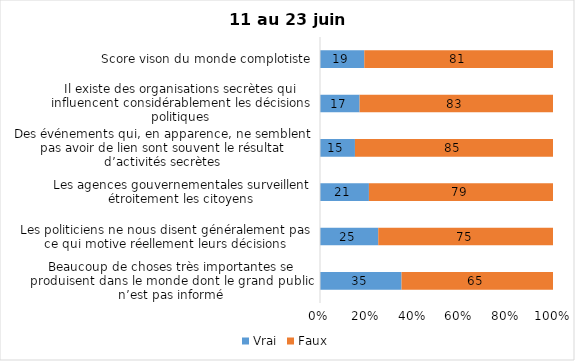
| Category | Vrai | Faux |
|---|---|---|
| Beaucoup de choses très importantes se produisent dans le monde dont le grand public n’est pas informé | 35 | 65 |
| Les politiciens ne nous disent généralement pas ce qui motive réellement leurs décisions | 25 | 75 |
| Les agences gouvernementales surveillent étroitement les citoyens | 21 | 79 |
| Des événements qui, en apparence, ne semblent pas avoir de lien sont souvent le résultat d’activités secrètes | 15 | 85 |
| Il existe des organisations secrètes qui influencent considérablement les décisions politiques | 17 | 83 |
| Score vison du monde complotiste | 19 | 81 |